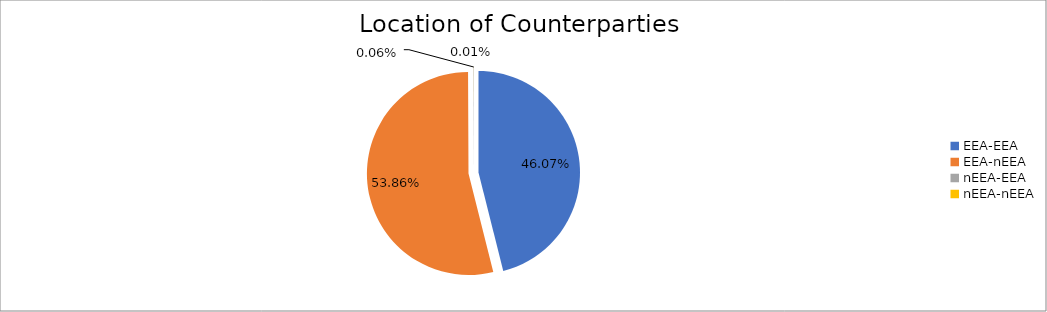
| Category | Series 0 |
|---|---|
| EEA-EEA | 5138586.064 |
| EEA-nEEA | 6006441.766 |
| nEEA-EEA | 7004.847 |
| nEEA-nEEA | 808.911 |